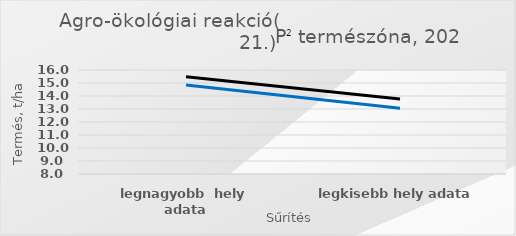
| Category | Series 0 | Series 1 |
|---|---|---|
| legnagyobb  hely adata | 14.849 | 15.473 |
| legkisebb hely adata | 13.057 | 13.761 |